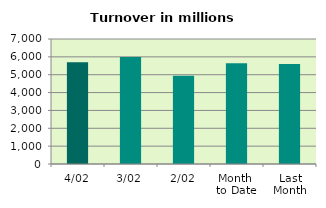
| Category | Series 0 |
|---|---|
| 4/02 | 5701.913 |
| 3/02 | 5985.9 |
| 2/02 | 4936.273 |
| Month 
to Date | 5648.854 |
| Last
Month | 5596.977 |